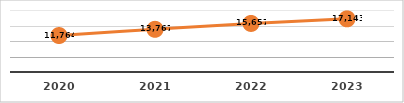
| Category | PERSONAS CAPACITADAS
PRIMER TRIMESTRE, EJERCICIO 2023 |
|---|---|
| 2020.0 | 11764 |
| 2021.0 | 13767 |
| 2022.0 | 15657 |
| 2023.0 | 17143 |